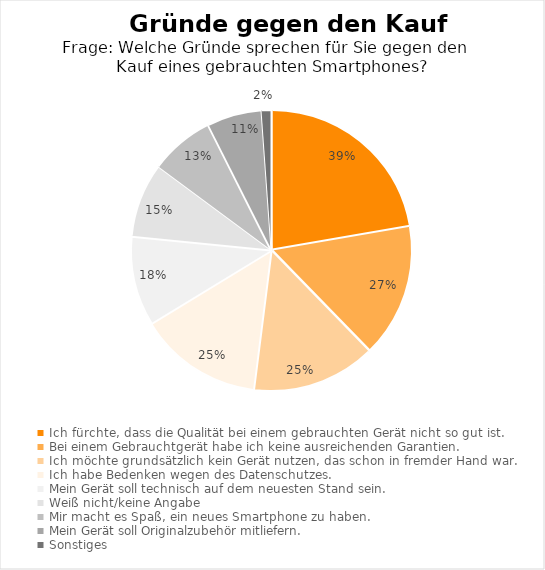
| Category | Series 0 |
|---|---|
| Ich fürchte, dass die Qualität bei einem gebrauchten Gerät nicht so gut ist. | 0.39 |
| Bei einem Gebrauchtgerät habe ich keine ausreichenden Garantien. | 0.27 |
| Ich möchte grundsätzlich kein Gerät nutzen, das schon in fremder Hand war. | 0.25 |
| Ich habe Bedenken wegen des Datenschutzes. | 0.25 |
| Mein Gerät soll technisch auf dem neuesten Stand sein. | 0.18 |
| Weiß nicht/keine Angabe | 0.15 |
| Mir macht es Spaß, ein neues Smartphone zu haben. | 0.13 |
| Mein Gerät soll Originalzubehör mitliefern. | 0.11 |
| Sonstiges | 0.02 |